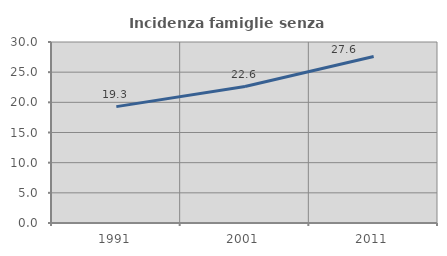
| Category | Incidenza famiglie senza nuclei |
|---|---|
| 1991.0 | 19.29 |
| 2001.0 | 22.613 |
| 2011.0 | 27.597 |